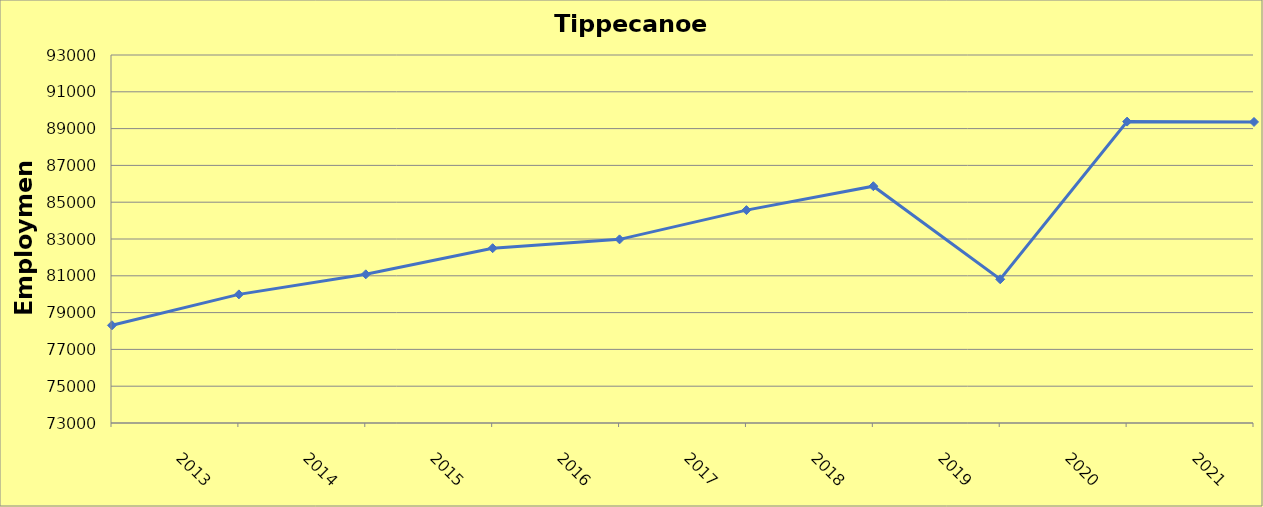
| Category | Tippecanoe County |
|---|---|
| 2013.0 | 78310 |
| 2014.0 | 79990 |
| 2015.0 | 81080 |
| 2016.0 | 82500 |
| 2017.0 | 82980 |
| 2018.0 | 84570 |
| 2019.0 | 85870 |
| 2020.0 | 80810 |
| 2021.0 | 89380 |
| 2022.0 | 89361 |